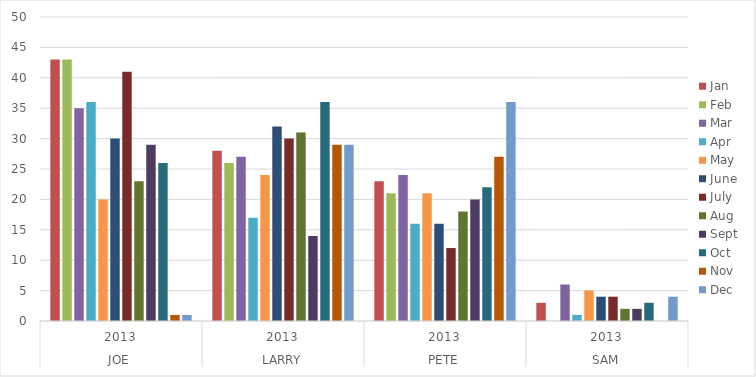
| Category | Jan | Feb | Mar | Apr | May | June | July | Aug | Sept | Oct | Nov | Dec |
|---|---|---|---|---|---|---|---|---|---|---|---|---|
| 0 | 43 | 43 | 35 | 36 | 20 | 30 | 41 | 23 | 29 | 26 | 1 | 1 |
| 1 | 28 | 26 | 27 | 17 | 24 | 32 | 30 | 31 | 14 | 36 | 29 | 29 |
| 2 | 23 | 21 | 24 | 16 | 21 | 16 | 12 | 18 | 20 | 22 | 27 | 36 |
| 3 | 3 | 0 | 6 | 1 | 5 | 4 | 4 | 2 | 2 | 3 | 0 | 4 |